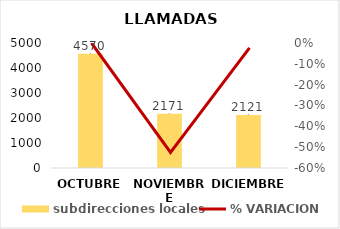
| Category | subdirecciones locales |
|---|---|
| OCTUBRE | 4570 |
| NOVIEMBRE | 2171 |
| DICIEMBRE | 2121 |